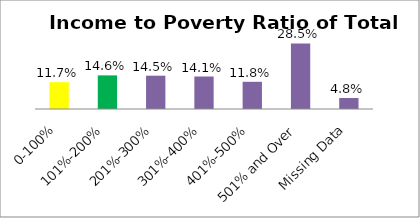
| Category | Percent |
|---|---|
| 0-100% | 0.117 |
| 101%-200% | 0.146 |
| 201%-300% | 0.145 |
| 301%-400% | 0.141 |
| 401%-500% | 0.118 |
| 501% and Over | 0.285 |
| Missing Data | 0.048 |